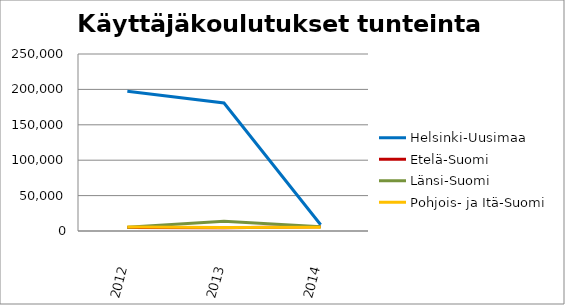
| Category | Helsinki-Uusimaa | Etelä-Suomi | Länsi-Suomi | Pohjois- ja Itä-Suomi |
|---|---|---|---|---|
| 2012.0 | 197547 | 4876.07 | 5212.96 | 5701.75 |
| 2013.0 | 180784.35 | 4594.75 | 13716.83 | 4955.25 |
| 2014.0 | 8847.2 | 6024.95 | 5863.53 | 5183.2 |